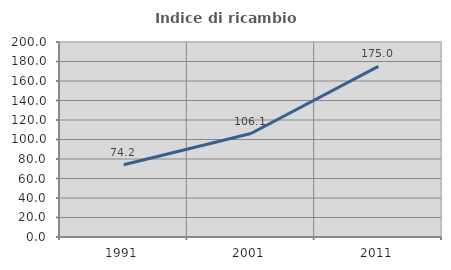
| Category | Indice di ricambio occupazionale  |
|---|---|
| 1991.0 | 74.157 |
| 2001.0 | 106.14 |
| 2011.0 | 175 |